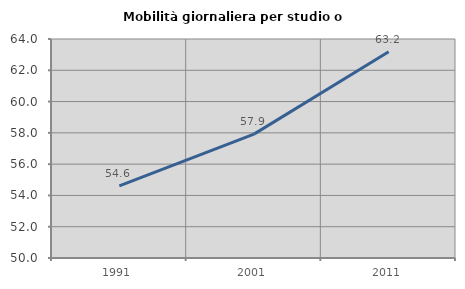
| Category | Mobilità giornaliera per studio o lavoro |
|---|---|
| 1991.0 | 54.613 |
| 2001.0 | 57.918 |
| 2011.0 | 63.182 |